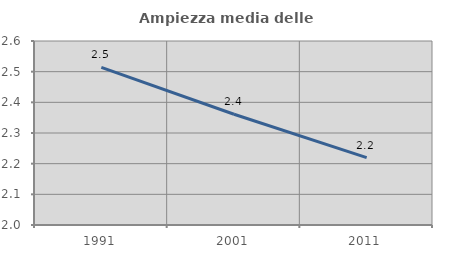
| Category | Ampiezza media delle famiglie |
|---|---|
| 1991.0 | 2.514 |
| 2001.0 | 2.361 |
| 2011.0 | 2.22 |